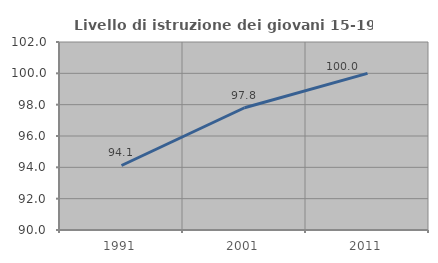
| Category | Livello di istruzione dei giovani 15-19 anni |
|---|---|
| 1991.0 | 94.118 |
| 2001.0 | 97.802 |
| 2011.0 | 100 |